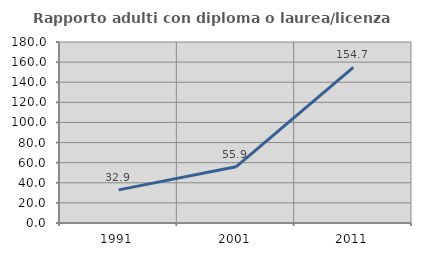
| Category | Rapporto adulti con diploma o laurea/licenza media  |
|---|---|
| 1991.0 | 32.914 |
| 2001.0 | 55.887 |
| 2011.0 | 154.743 |